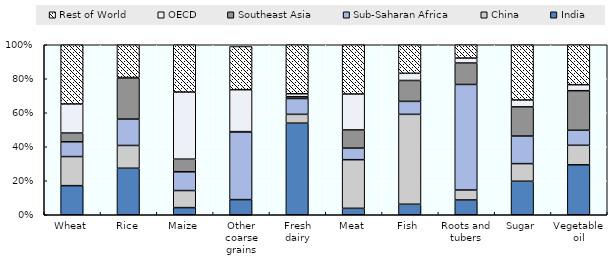
| Category | India | China | Sub-Saharan Africa | Southeast Asia | OECD | Rest of World |
|---|---|---|---|---|---|---|
| Wheat | 15.905 | 15.897 | 8.057 | 4.798 | 15.87 | 32.366 |
| Rice | 17.907 | 8.765 | 10.15 | 15.818 | 0.189 | 12.608 |
| Maize | 6.132 | 14.67 | 16.115 | 10.852 | 57.639 | 40.659 |
| Other coarse grains | 3.085 | -0.353 | 13.793 | 0.049 | 8.539 | 8.8 |
| Fresh dairy | 56.154 | 5.399 | 9.697 | 1.102 | 1.838 | 30.025 |
| Meat | 1.54 | 11.646 | 2.781 | 4.352 | 8.605 | 11.795 |
| Fish | 1.589 | 13.563 | 1.957 | 3.154 | 1.083 | 4.307 |
| Roots and tubers | 2.666 | 1.795 | 19.03 | 3.865 | 0.893 | 2.397 |
| Sugar | 6.905 | 3.626 | 5.677 | 6.012 | 1.414 | 11.374 |
| Vegetable oil | 11.621 | 4.544 | 3.499 | 9.209 | 1.398 | 9.295 |